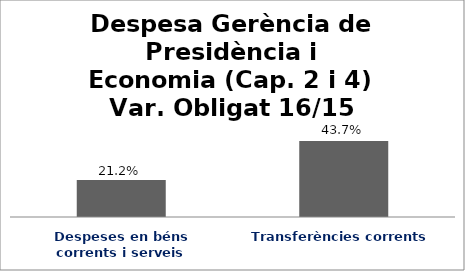
| Category | Series 0 |
|---|---|
| Despeses en béns corrents i serveis | 0.212 |
| Transferències corrents | 0.437 |